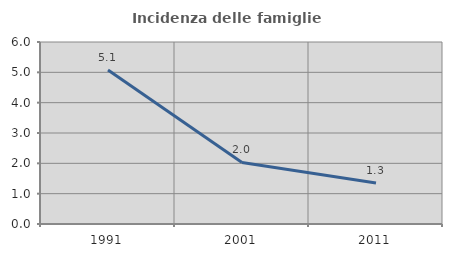
| Category | Incidenza delle famiglie numerose |
|---|---|
| 1991.0 | 5.076 |
| 2001.0 | 2.027 |
| 2011.0 | 1.349 |